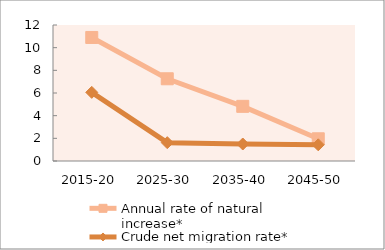
| Category | Annual rate of natural increase* | Crude net migration rate* |
|---|---|---|
| 2015-20 | 10.9 | 6.057 |
| 2025-30 | 7.255 | 1.618 |
| 2035-40 | 4.823 | 1.5 |
| 2045-50 | 1.96 | 1.429 |